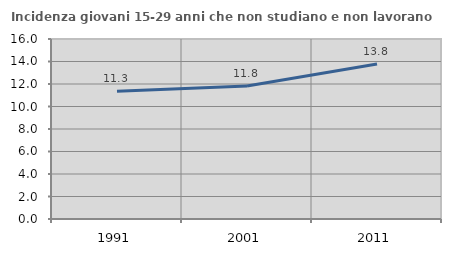
| Category | Incidenza giovani 15-29 anni che non studiano e non lavorano  |
|---|---|
| 1991.0 | 11.348 |
| 2001.0 | 11.822 |
| 2011.0 | 13.781 |